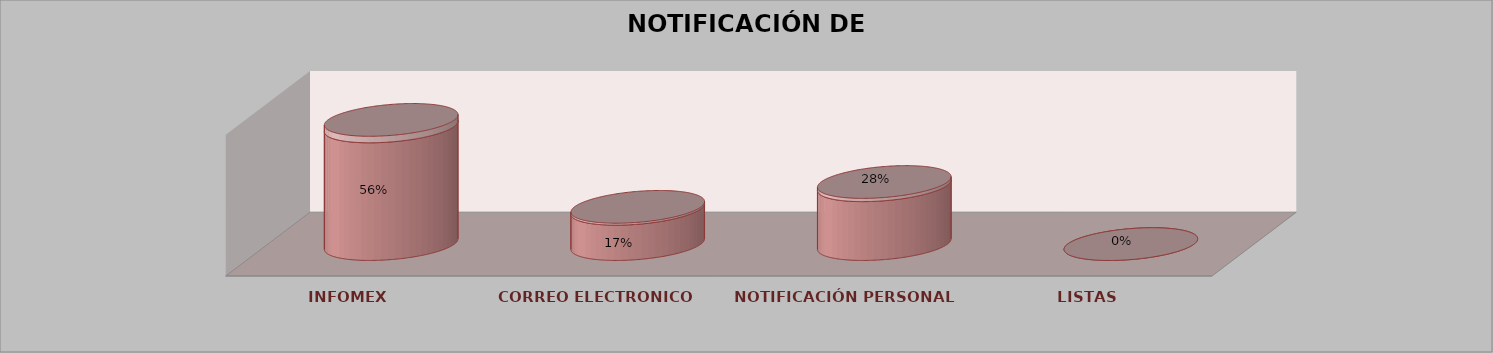
| Category | Series 0 | Series 1 | Series 2 | Series 3 | Series 4 |
|---|---|---|---|---|---|
| INFOMEX |  |  |  | 10 | 0.556 |
| CORREO ELECTRONICO |  |  |  | 3 | 0.167 |
| NOTIFICACIÓN PERSONAL |  |  |  | 5 | 0.278 |
| LISTAS |  |  |  | 0 | 0 |